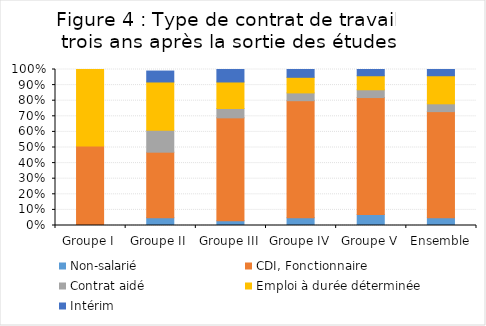
| Category | Non-salarié | CDI, Fonctionnaire | Contrat aidé | Emploi à durée déterminée | Intérim  |
|---|---|---|---|---|---|
| Groupe I | 0 | 0.51 | 0 | 0.49 | 0 |
| Groupe II | 0.05 | 0.42 | 0.14 | 0.31 | 0.07 |
| Groupe III | 0.03 | 0.66 | 0.06 | 0.17 | 0.08 |
| Groupe IV | 0.05 | 0.75 | 0.05 | 0.1 | 0.05 |
| Groupe V | 0.07 | 0.75 | 0.05 | 0.09 | 0.05 |
| Ensemble | 0.05 | 0.68 | 0.05 | 0.18 | 0.05 |